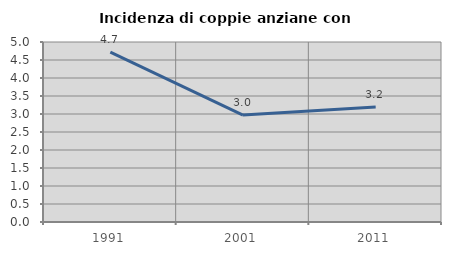
| Category | Incidenza di coppie anziane con figli |
|---|---|
| 1991.0 | 4.717 |
| 2001.0 | 2.97 |
| 2011.0 | 3.191 |